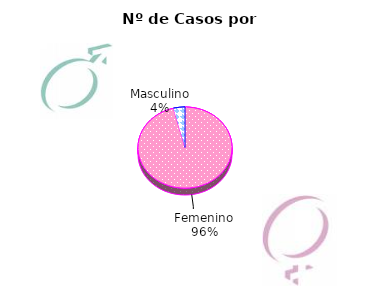
| Category | Series 0 |
|---|---|
| Femenino | 27219 |
| Masculino | 1126 |